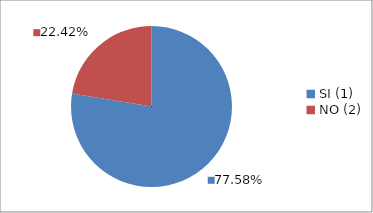
| Category | Series 0 |
|---|---|
| SI (1) | 0.776 |
| NO (2) | 0.224 |